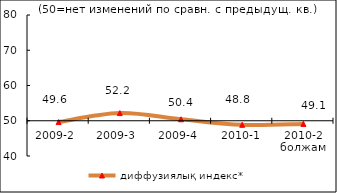
| Category | диффузиялық индекс* |
|---|---|
| 2009-2  | 49.625 |
| 2009-3  | 52.17 |
| 2009-4  | 50.42 |
| 2010-1 | 48.845 |
| 2010-2 болжам | 49.105 |